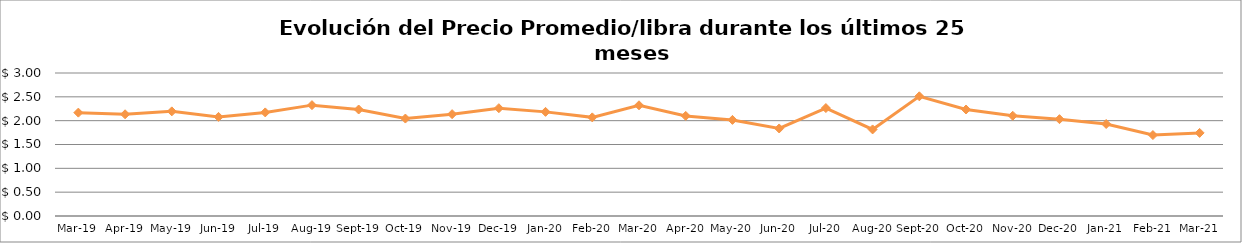
| Category | Series 0 |
|---|---|
| 2019-03-01 | 2.169 |
| 2019-04-01 | 2.134 |
| 2019-05-01 | 2.195 |
| 2019-06-01 | 2.079 |
| 2019-07-01 | 2.173 |
| 2019-08-01 | 2.326 |
| 2019-09-01 | 2.234 |
| 2019-10-01 | 2.044 |
| 2019-11-01 | 2.137 |
| 2019-12-01 | 2.262 |
| 2020-01-01 | 2.185 |
| 2020-02-01 | 2.069 |
| 2020-03-01 | 2.323 |
| 2020-04-01 | 2.1 |
| 2020-05-01 | 2.016 |
| 2020-06-01 | 1.837 |
| 2020-07-01 | 2.265 |
| 2020-08-01 | 1.816 |
| 2020-09-01 | 2.511 |
| 2020-10-01 | 2.234 |
| 2020-11-01 | 2.103 |
| 2020-12-01 | 2.031 |
| 2021-01-01 | 1.93 |
| 2021-02-01 | 1.698 |
| 2021-03-01 | 1.744 |